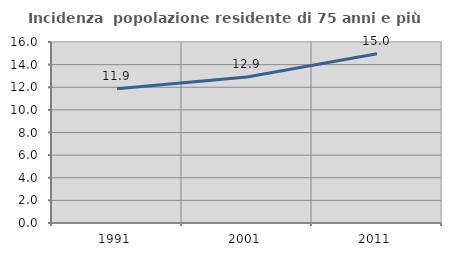
| Category | Incidenza  popolazione residente di 75 anni e più |
|---|---|
| 1991.0 | 11.876 |
| 2001.0 | 12.903 |
| 2011.0 | 14.966 |